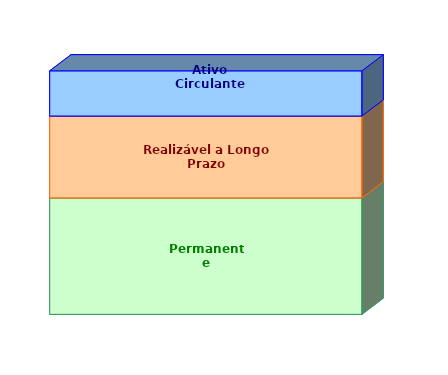
| Category | Permanente | Realizável a Longo Prazo | Ativo Circulante |
|---|---|---|---|
| 0 | 0.478 | 0.336 | 0.186 |